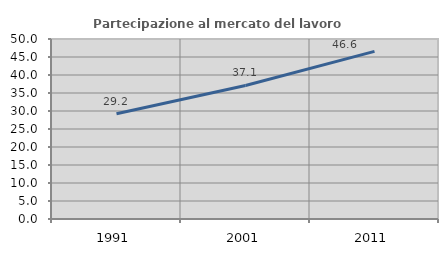
| Category | Partecipazione al mercato del lavoro  femminile |
|---|---|
| 1991.0 | 29.231 |
| 2001.0 | 37.104 |
| 2011.0 | 46.552 |